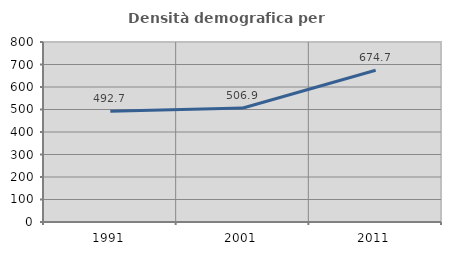
| Category | Densità demografica |
|---|---|
| 1991.0 | 492.687 |
| 2001.0 | 506.914 |
| 2011.0 | 674.661 |